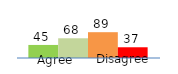
| Category | Series 0 | Series 1 | Series 2 | Series 3 |
|---|---|---|---|---|
| 0 | 45 | 68 | 89 | 37 |